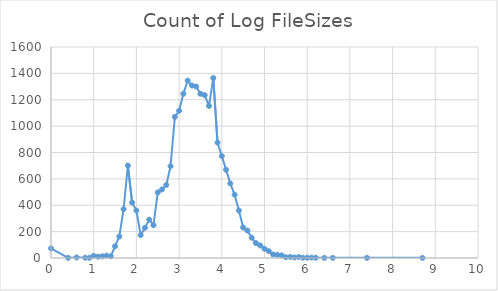
| Category | Count of Log FileSizes |
|---|---|
| 0.0 | 73 |
| 0.4 | 1 |
| 0.6 | 4 |
| 0.8 | 2 |
| 0.9 | 2 |
| 1.0 | 16 |
| 1.1 | 10 |
| 1.2 | 13 |
| 1.3 | 18 |
| 1.4 | 13 |
| 1.5 | 89 |
| 1.6 | 163 |
| 1.7 | 370 |
| 1.8 | 701 |
| 1.9 | 420 |
| 2.0 | 360 |
| 2.1 | 174 |
| 2.2 | 229 |
| 2.3 | 291 |
| 2.4 | 249 |
| 2.5 | 497 |
| 2.6 | 520 |
| 2.7 | 554 |
| 2.8 | 696 |
| 2.9 | 1070 |
| 3.0 | 1117 |
| 3.1 | 1245 |
| 3.2 | 1345 |
| 3.3 | 1308 |
| 3.4 | 1300 |
| 3.5 | 1245 |
| 3.6 | 1235 |
| 3.7 | 1153 |
| 3.8 | 1365 |
| 3.9 | 875 |
| 4.0 | 773 |
| 4.1 | 669 |
| 4.2 | 565 |
| 4.3 | 480 |
| 4.4 | 360 |
| 4.5 | 231 |
| 4.6 | 208 |
| 4.7 | 154 |
| 4.8 | 113 |
| 4.9 | 95 |
| 5.0 | 70 |
| 5.1 | 52 |
| 5.2 | 27 |
| 5.3 | 24 |
| 5.4 | 20 |
| 5.5 | 6 |
| 5.6 | 8 |
| 5.7 | 4 |
| 5.8 | 7 |
| 5.9 | 2 |
| 6.0 | 2 |
| 6.1 | 3 |
| 6.2 | 2 |
| 6.4 | 1 |
| 6.6 | 1 |
| 7.4 | 1 |
| 8.7 | 1 |